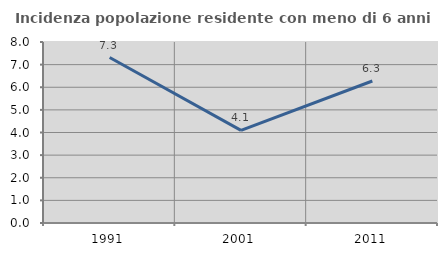
| Category | Incidenza popolazione residente con meno di 6 anni |
|---|---|
| 1991.0 | 7.314 |
| 2001.0 | 4.093 |
| 2011.0 | 6.276 |